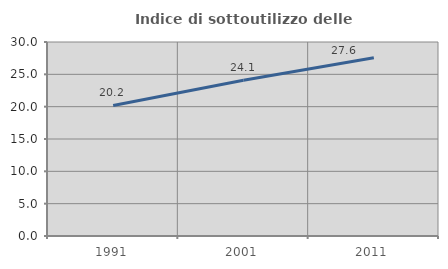
| Category | Indice di sottoutilizzo delle abitazioni  |
|---|---|
| 1991.0 | 20.19 |
| 2001.0 | 24.086 |
| 2011.0 | 27.562 |